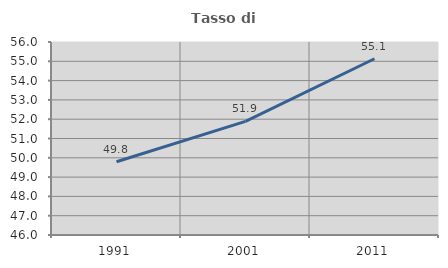
| Category | Tasso di occupazione   |
|---|---|
| 1991.0 | 49.793 |
| 2001.0 | 51.887 |
| 2011.0 | 55.132 |